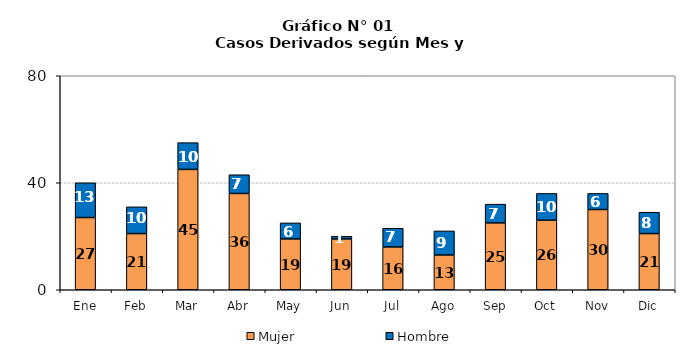
| Category | Mujer | Hombre |
|---|---|---|
| Ene | 27 | 13 |
| Feb | 21 | 10 |
| Mar | 45 | 10 |
| Abr | 36 | 7 |
| May | 19 | 6 |
| Jun | 19 | 1 |
| Jul | 16 | 7 |
| Ago | 13 | 9 |
| Sep | 25 | 7 |
| Oct | 26 | 10 |
| Nov | 30 | 6 |
| Dic | 21 | 8 |